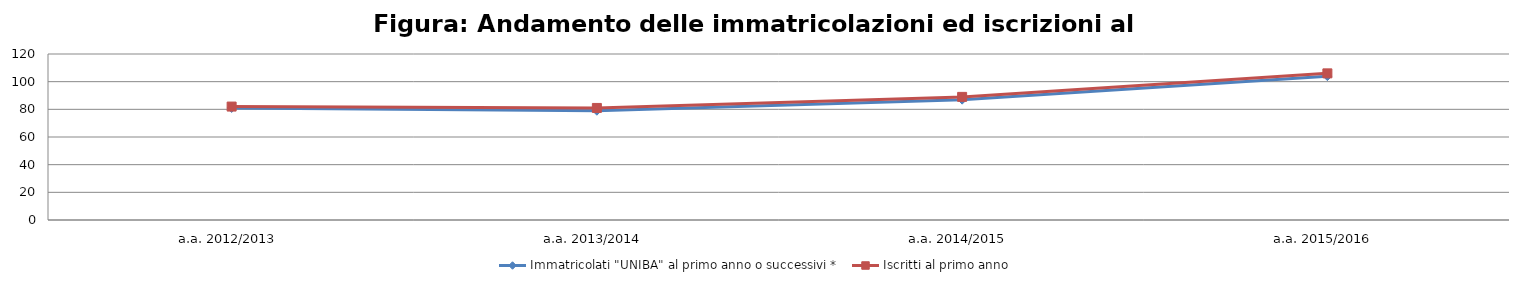
| Category | Immatricolati "UNIBA" al primo anno o successivi * | Iscritti al primo anno  |
|---|---|---|
| a.a. 2012/2013 | 81 | 82 |
| a.a. 2013/2014 | 79 | 81 |
| a.a. 2014/2015 | 87 | 89 |
| a.a. 2015/2016 | 104 | 106 |